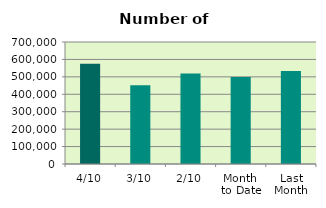
| Category | Series 0 |
|---|---|
| 4/10 | 574792 |
| 3/10 | 451776 |
| 2/10 | 519452 |
| Month 
to Date | 499152.5 |
| Last
Month | 533338.9 |